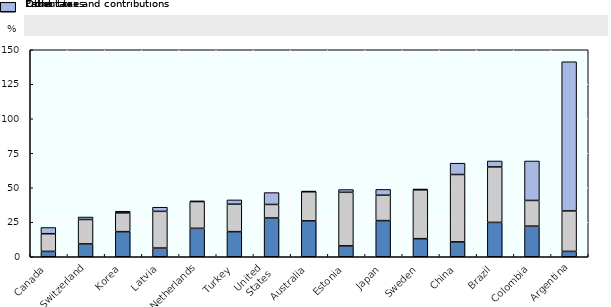
| Category | Profit tax | Labour tax and contributions | Other taxes |
|---|---|---|---|
| Canada | 3.9 | 12.8 | 4.5 |
| Switzerland | 9.3 | 17.7 | 1.8 |
| Korea | 18.2 | 13.6 | 1.2 |
| Latvia | 6.3 | 26.6 | 3 |
| Netherlands | 20.6 | 19.4 | 0.4 |
| Turkey | 18.2 | 19.9 | 3.1 |
| United 
States | 28.1 | 9.8 | 8.6 |
| Australia | 26 | 21.1 | 0.5 |
| Estonia | 7.9 | 38.8 | 2 |
| Japan | 26.2 | 18.4 | 4.2 |
| Sweden | 13.1 | 35.4 | 0.6 |
| China | 10.8 | 48.8 | 8.2 |
| Brazil | 24.9 | 40.2 | 4.3 |
| Colombia | 22.2 | 18.6 | 28.6 |
| Argentina | 3.9 | 29.3 | 108.1 |